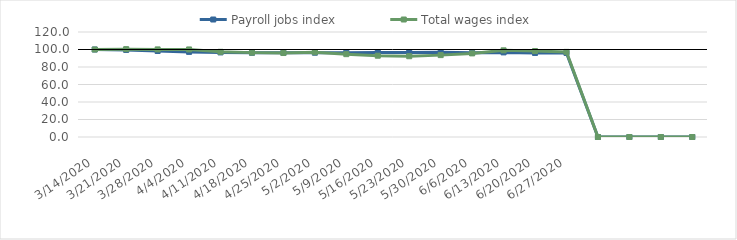
| Category | Payroll jobs index | Total wages index |
|---|---|---|
| 14/03/2020 | 100 | 100 |
| 21/03/2020 | 99.5 | 100.427 |
| 28/03/2020 | 98.299 | 100.113 |
| 04/04/2020 | 97.269 | 100.064 |
| 11/04/2020 | 96.663 | 97.342 |
| 18/04/2020 | 96.272 | 96.429 |
| 25/04/2020 | 96.205 | 95.977 |
| 02/05/2020 | 96.328 | 96.903 |
| 09/05/2020 | 96.425 | 94.675 |
| 16/05/2020 | 96.672 | 92.9 |
| 23/05/2020 | 96.638 | 92.301 |
| 30/05/2020 | 96.83 | 93.572 |
| 06/06/2020 | 96.19 | 95.538 |
| 13/06/2020 | 96.693 | 99.04 |
| 20/06/2020 | 96.049 | 98.212 |
| 27/06/2020 | 96.09 | 97.265 |